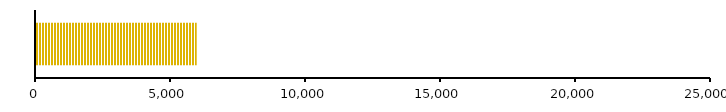
| Category | ВСЕГО ОБЯЗАТЕЛЬСТВ | ВСЕГО АКТИВОВ |
|---|---|---|
| 0 | 5952 | 23216 |